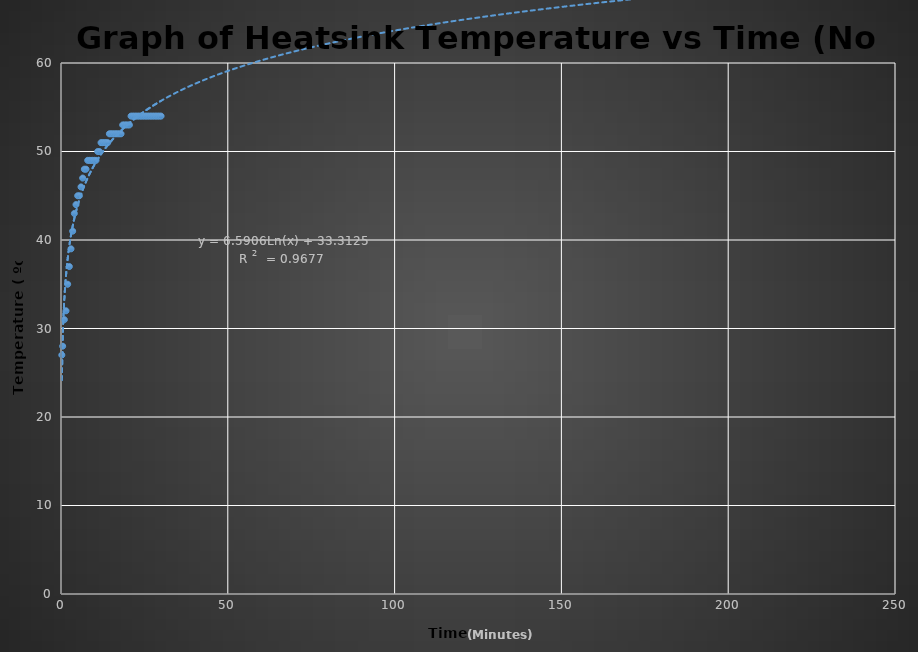
| Category | Series 0 |
|---|---|
| 0.25 | 27 |
| 0.5 | 28 |
| 1.0 | 31 |
| 1.5 | 32 |
| 2.0 | 35 |
| 2.5 | 37 |
| 3.0 | 39 |
| 3.5 | 41 |
| 4.0 | 43 |
| 4.5 | 44 |
| 5.0 | 45 |
| 5.5 | 45 |
| 6.0 | 46 |
| 6.5 | 47 |
| 7.0 | 48 |
| 7.5 | 48 |
| 8.0 | 49 |
| 8.5 | 49 |
| 9.0 | 49 |
| 9.5 | 49 |
| 10.0 | 49 |
| 10.5 | 49 |
| 11.0 | 50 |
| 11.5 | 50 |
| 12.0 | 51 |
| 12.5 | 51 |
| 13.0 | 51 |
| 13.5 | 51 |
| 14.0 | 51 |
| 14.5 | 52 |
| 15.0 | 52 |
| 15.5 | 52 |
| 16.0 | 52 |
| 16.5 | 52 |
| 17.0 | 52 |
| 17.5 | 52 |
| 18.0 | 52 |
| 18.5 | 53 |
| 19.0 | 53 |
| 19.5 | 53 |
| 20.0 | 53 |
| 20.5 | 53 |
| 21.0 | 54 |
| 21.5 | 54 |
| 22.0 | 54 |
| 22.5 | 54 |
| 23.0 | 54 |
| 23.5 | 54 |
| 24.0 | 54 |
| 24.5 | 54 |
| 25.0 | 54 |
| 25.5 | 54 |
| 26.0 | 54 |
| 26.5 | 54 |
| 27.0 | 54 |
| 27.5 | 54 |
| 28.0 | 54 |
| 28.5 | 54 |
| 29.0 | 54 |
| 29.5 | 54 |
| 30.0 | 54 |